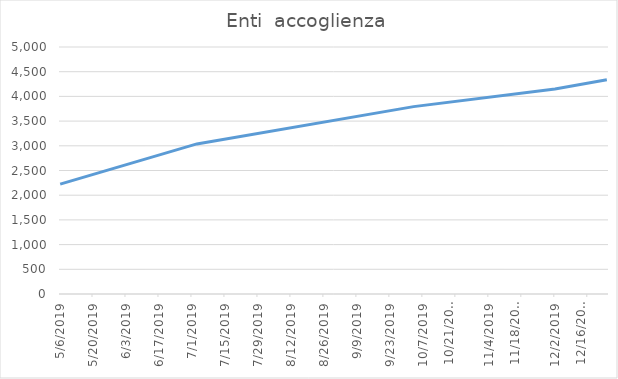
| Category | Enti  accoglienza |
|---|---|
| 5/6/19 | 2223 |
| 7/3/19 | 3038 |
| 10/3/19 | 3793 |
| 12/2/19 | 4149 |
| 12/24/19 | 4335 |